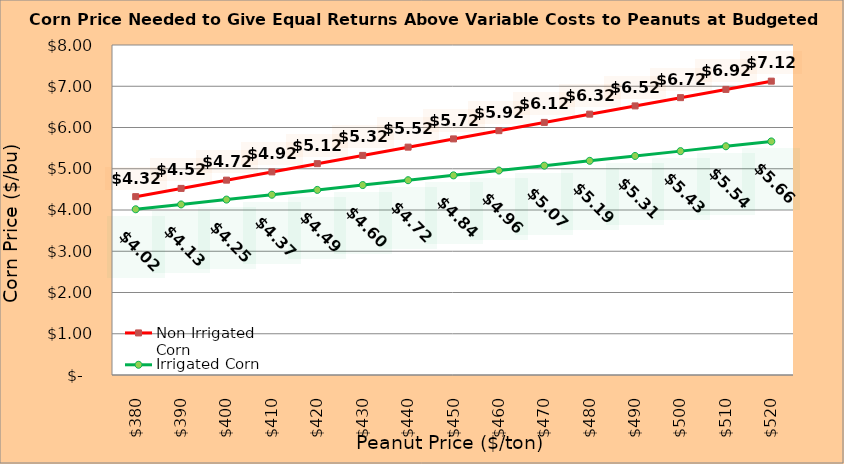
| Category | Non Irrigated Corn | Irrigated Corn |
|---|---|---|
| 380.0 | 4.324 | 4.017 |
| 390.0 | 4.524 | 4.135 |
| 400.0 | 4.724 | 4.252 |
| 410.0 | 4.924 | 4.37 |
| 420.0 | 5.124 | 4.487 |
| 430.0 | 5.324 | 4.605 |
| 440.0 | 5.524 | 4.722 |
| 450.0 | 5.724 | 4.84 |
| 460.0 | 5.924 | 4.957 |
| 470.0 | 6.124 | 5.075 |
| 480.0 | 6.324 | 5.192 |
| 490.0 | 6.524 | 5.31 |
| 500.0 | 6.724 | 5.427 |
| 510.0 | 6.924 | 5.545 |
| 520.0 | 7.124 | 5.662 |